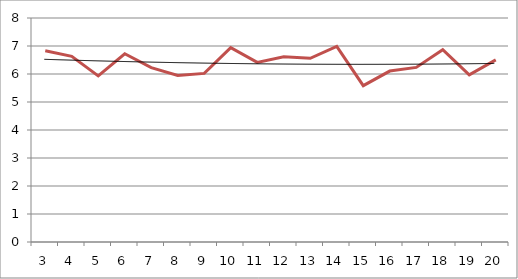
| Category | Series 0 |
|---|---|
| 3.0 | 6.83 |
| 4.0 | 6.629 |
| 5.0 | 5.934 |
| 6.0 | 6.723 |
| 7.0 | 6.227 |
| 8.0 | 5.949 |
| 9.0 | 6.022 |
| 10.0 | 6.941 |
| 11.0 | 6.416 |
| 12.0 | 6.612 |
| 13.0 | 6.561 |
| 14.0 | 6.984 |
| 15.0 | 5.583 |
| 16.0 | 6.105 |
| 17.0 | 6.236 |
| 18.0 | 6.869 |
| 19.0 | 5.97 |
| 20.0 | 6.505 |